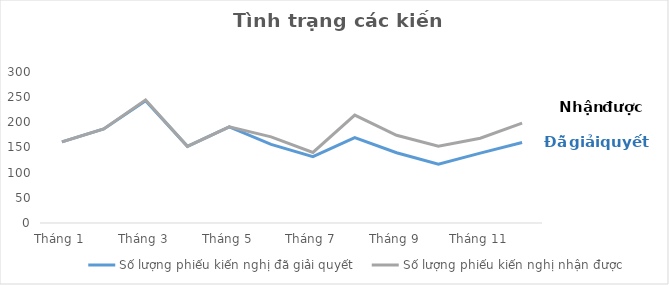
| Category | Số lượng phiếu kiến nghị đã giải quyết | Số lượng phiếu kiến nghị nhận được |
|---|---|---|
| Tháng 1 | 161.231 | 161.231 |
| Tháng 2 | 186.959 | 186.959 |
| Tháng 3 | 243.076 | 244.63 |
| Tháng 4 | 152.262 | 152.262 |
| Tháng 5 | 190.903 | 190.903 |
| Tháng 6 | 156.068 | 171.214 |
| Tháng 7 | 131.894 | 140.224 |
| Tháng 8 | 169.817 | 214.398 |
| Tháng 9 | 139.546 | 174.302 |
| Tháng 10 | 116.768 | 152.38 |
| Tháng 11 | 138.788 | 168.322 |
| Tháng 12 | 160.031 | 198.554 |